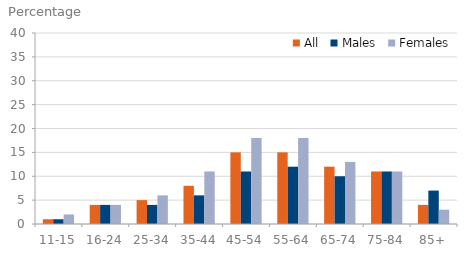
| Category | All | Males | Females |
|---|---|---|---|
| 11-15 | 1 | 1 | 2 |
| 16-24 | 4 | 4 | 4 |
| 25-34 | 5 | 4 | 6 |
| 35-44 | 8 | 6 | 11 |
| 45-54 | 15 | 11 | 18 |
| 55-64 | 15 | 12 | 18 |
| 65-74 | 12 | 10 | 13 |
| 75-84 | 11 | 11 | 11 |
| 85+ | 4 | 7 | 3 |